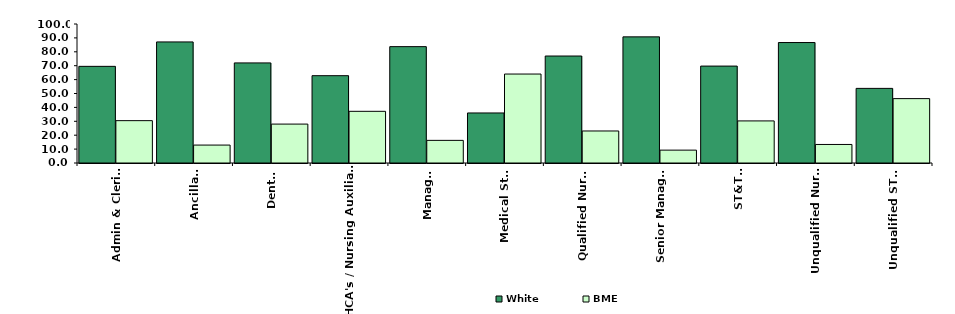
| Category | White | BME |
|---|---|---|
| Admin & Clerical | 69.53 | 30.47 |
| Ancillary | 87.097 | 12.903 |
| Dental | 72 | 28 |
| HCA's / Nursing Auxiliaries | 62.822 | 37.178 |
| Manager | 83.721 | 16.279 |
| Medical Staff | 36 | 64 |
| Qualified Nurses | 76.963 | 23.037 |
| Senior Managers | 90.741 | 9.259 |
| ST&T's | 69.72 | 30.28 |
| Unqualified Nurses | 86.667 | 13.333 |
| Unqualified ST&T's | 53.684 | 46.316 |